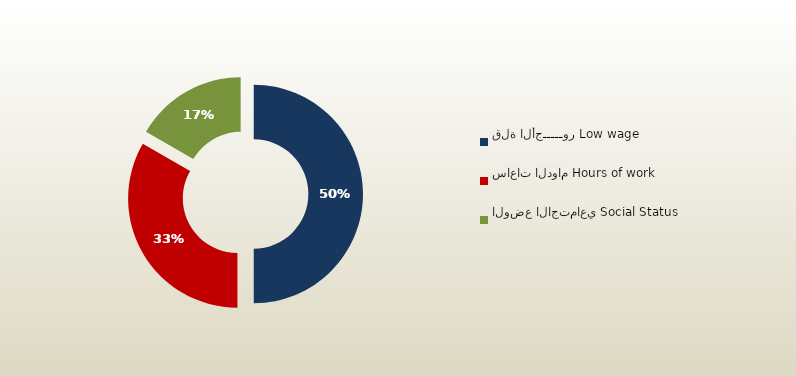
| Category | المجموع
Total |
|---|---|
| قلة الأجـــــور Low wage | 186 |
| ساعات الدوام Hours of work | 124 |
| الوضع الاجتماعي Social Status | 62 |